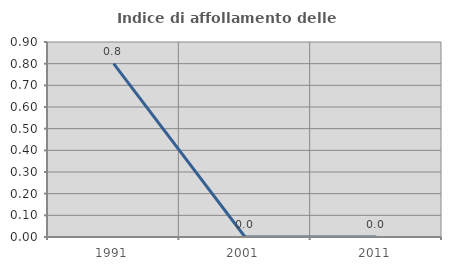
| Category | Indice di affollamento delle abitazioni  |
|---|---|
| 1991.0 | 0.8 |
| 2001.0 | 0 |
| 2011.0 | 0 |